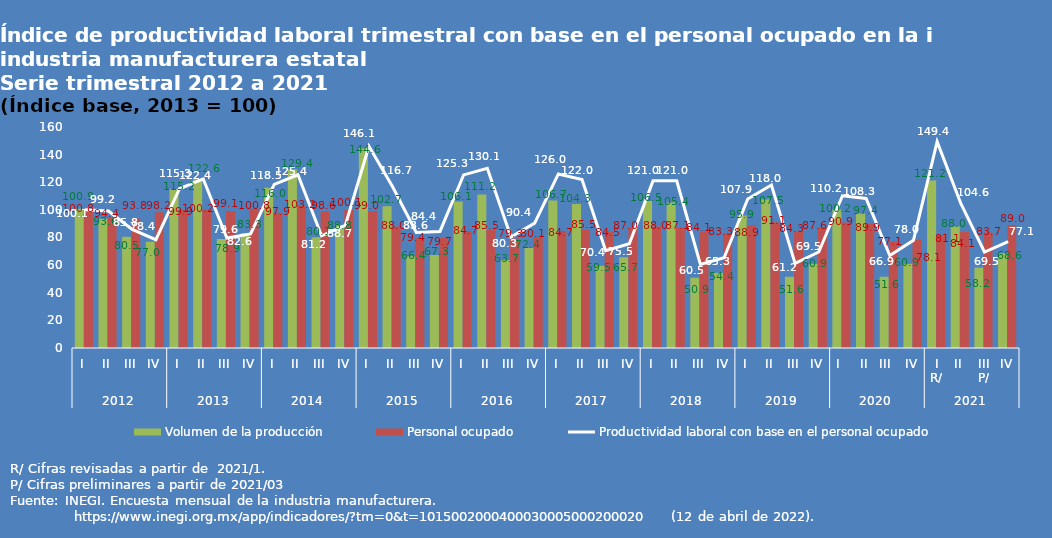
| Category | Volumen de la producción | Personal ocupado |
|---|---|---|
| 0 | 100.9 | 100.8 |
| 1 | 93.6 | 94.4 |
| 2 | 80.5 | 93.8 |
| 3 | 77 | 98.2 |
| 4 | 115.2 | 99.9 |
| 5 | 122.6 | 100.2 |
| 6 | 78.9 | 99.1 |
| 7 | 83.3 | 100.8 |
| 8 | 116 | 97.9 |
| 9 | 129.4 | 103.2 |
| 10 | 80.1 | 98.6 |
| 11 | 88.8 | 100.1 |
| 12 | 144.6 | 99 |
| 13 | 102.7 | 88 |
| 14 | 66.4 | 79.4 |
| 15 | 67.3 | 79.7 |
| 16 | 106.1 | 84.7 |
| 17 | 111.2 | 85.5 |
| 18 | 63.7 | 79.3 |
| 19 | 72.4 | 80.1 |
| 20 | 106.7 | 84.7 |
| 21 | 104.3 | 85.5 |
| 22 | 59.5 | 84.5 |
| 23 | 65.7 | 87 |
| 24 | 106.5 | 88 |
| 25 | 105.4 | 87.1 |
| 26 | 50.9 | 84.1 |
| 27 | 54.4 | 83.3 |
| 28 | 95.9 | 88.9 |
| 29 | 107.5 | 91.1 |
| 30 | 51.6 | 84.3 |
| 31 | 60.9 | 87.6 |
| 32 | 100.2 | 90.9 |
| 33 | 97.4 | 89.9 |
| 34 | 51.6 | 77.1 |
| 35 | 60.9 | 78.1 |
| 36 | 121.2 | 81.1 |
| 37 | 88 | 84.1 |
| 38 | 58.2 | 83.7 |
| 39 | 68.6 | 89 |